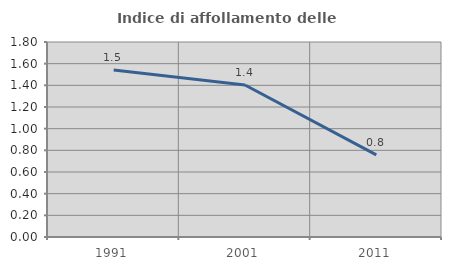
| Category | Indice di affollamento delle abitazioni  |
|---|---|
| 1991.0 | 1.542 |
| 2001.0 | 1.403 |
| 2011.0 | 0.758 |